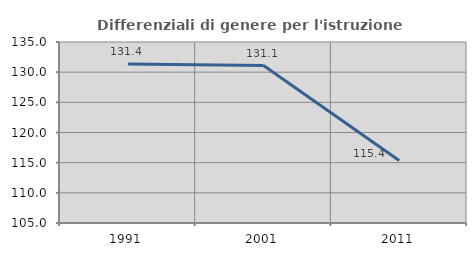
| Category | Differenziali di genere per l'istruzione superiore |
|---|---|
| 1991.0 | 131.369 |
| 2001.0 | 131.094 |
| 2011.0 | 115.362 |